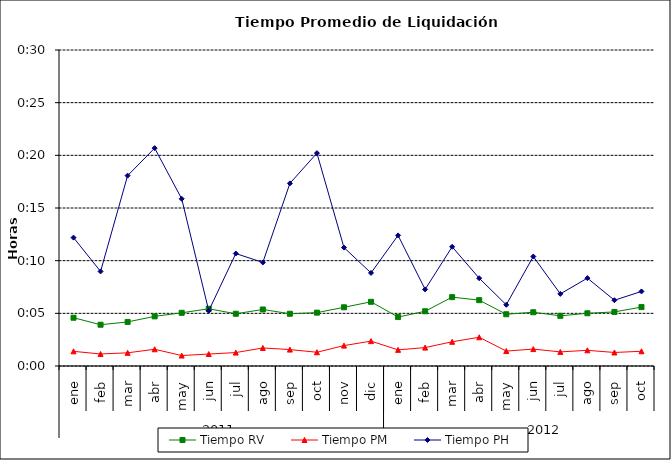
| Category | Tiempo RV | Tiempo PM | Tiempo PH |
|---|---|---|---|
| 0 | 0.003 | 0.001 | 0.009 |
| 1 | 0.003 | 0.001 | 0.006 |
| 2 | 0.003 | 0.001 | 0.013 |
| 3 | 0.003 | 0.001 | 0.014 |
| 4 | 0.004 | 0.001 | 0.011 |
| 5 | 0.004 | 0.001 | 0.004 |
| 6 | 0.003 | 0.001 | 0.007 |
| 7 | 0.004 | 0.001 | 0.007 |
| 8 | 0.003 | 0.001 | 0.012 |
| 9 | 0.004 | 0.001 | 0.014 |
| 10 | 0.004 | 0.001 | 0.008 |
| 11 | 0.004 | 0.002 | 0.006 |
| 12 | 0.003 | 0.001 | 0.009 |
| 13 | 0.004 | 0.001 | 0.005 |
| 14 | 0.005 | 0.002 | 0.008 |
| 15 | 0.004 | 0.002 | 0.006 |
| 16 | 0.003 | 0.001 | 0.004 |
| 17 | 0.004 | 0.001 | 0.007 |
| 18 | 0.003 | 0.001 | 0.005 |
| 19 | 0.004 | 0.001 | 0.006 |
| 20 | 0.004 | 0.001 | 0.004 |
| 21 | 0.004 | 0.001 | 0.005 |